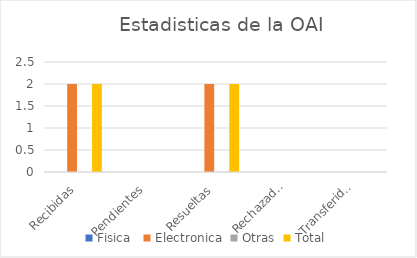
| Category | Fisica  | Electronica | Otras | Total |
|---|---|---|---|---|
| Recibidas | 0 | 2 | 0 | 2 |
| Pendientes | 0 | 0 | 0 | 0 |
| Resueltas | 0 | 2 | 0 | 2 |
| Rechazadas | 0 | 0 | 0 | 0 |
| Transferidas | 0 | 0 | 0 | 0 |